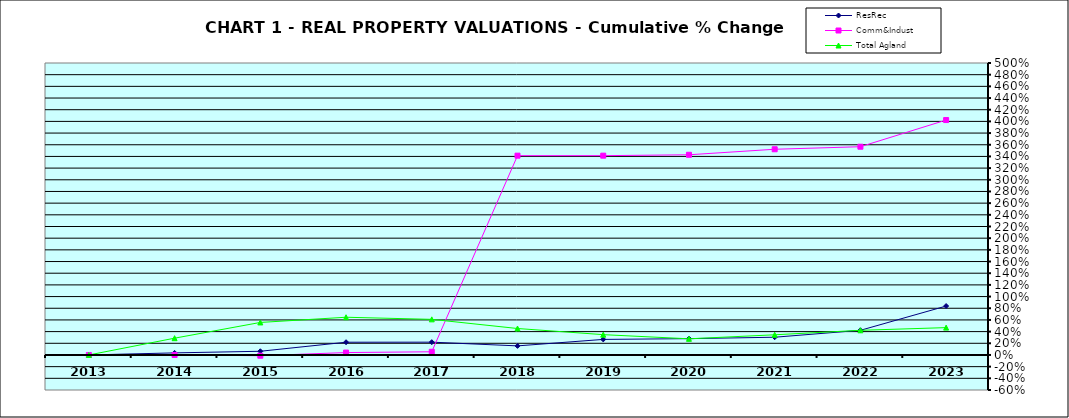
| Category | ResRec | Comm&Indust | Total Agland |
|---|---|---|---|
| 2013.0 | 0 | 0 | 0 |
| 2014.0 | 0.036 | 0 | 0.287 |
| 2015.0 | 0.063 | -0.013 | 0.557 |
| 2016.0 | 0.218 | 0.041 | 0.646 |
| 2017.0 | 0.219 | 0.055 | 0.61 |
| 2018.0 | 0.156 | 3.413 | 0.453 |
| 2019.0 | 0.266 | 3.413 | 0.348 |
| 2020.0 | 0.279 | 3.428 | 0.277 |
| 2021.0 | 0.304 | 3.523 | 0.346 |
| 2022.0 | 0.422 | 3.566 | 0.422 |
| 2023.0 | 0.838 | 4.023 | 0.468 |